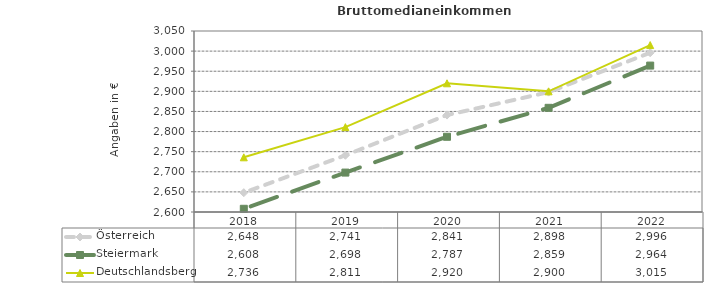
| Category | Österreich | Steiermark | Deutschlandsberg |
|---|---|---|---|
| 2022.0 | 2996 | 2964 | 3015 |
| 2021.0 | 2898 | 2859 | 2900 |
| 2020.0 | 2841 | 2787 | 2920 |
| 2019.0 | 2741 | 2698 | 2811 |
| 2018.0 | 2648 | 2608 | 2736 |